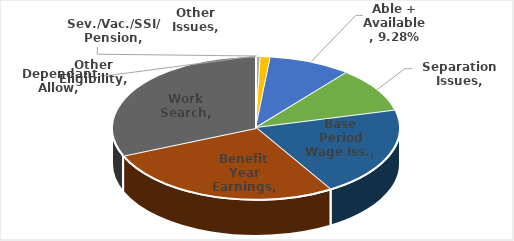
| Category | Series 0 |
|---|---|
| Dependant Allow | 0 |
| Sev./Vac./SSI/ Pension | 0.001 |
| Other Issues | 0.004 |
| Other Eligibility | 0.011 |
| Able + Available | 0.093 |
| Separation Issues | 0.102 |
| Base Period Wage Iss. | 0.203 |
| Benefit Year Earnings | 0.273 |
| Work Search | 0.313 |